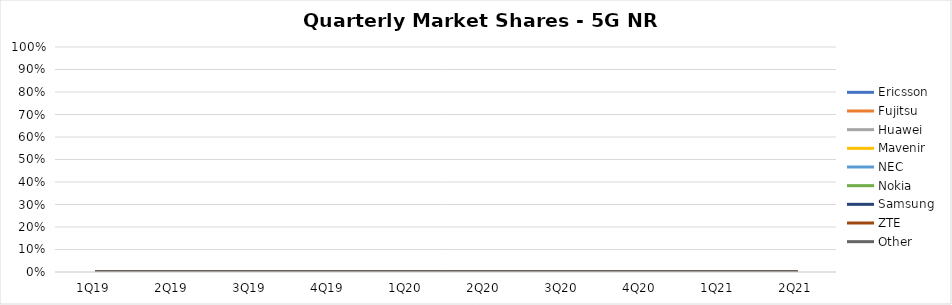
| Category | Ericsson | Fujitsu | Huawei | Mavenir | NEC | Nokia | Samsung | ZTE | Other |
|---|---|---|---|---|---|---|---|---|---|
| 1Q19 | 0 | 0 | 0 | 0 | 0 | 0 | 0 | 0 | 0 |
| 2Q19 | 0 | 0 | 0 | 0 | 0 | 0 | 0 | 0 | 0 |
| 3Q19 | 0 | 0 | 0 | 0 | 0 | 0 | 0 | 0 | 0 |
| 4Q19 | 0 | 0 | 0 | 0 | 0 | 0 | 0 | 0 | 0 |
| 1Q20 | 0 | 0 | 0 | 0 | 0 | 0 | 0 | 0 | 0 |
| 2Q20 | 0 | 0 | 0 | 0 | 0 | 0 | 0 | 0 | 0 |
| 3Q20 | 0 | 0 | 0 | 0 | 0 | 0 | 0 | 0 | 0 |
| 4Q20 | 0 | 0 | 0 | 0 | 0 | 0 | 0 | 0 | 0 |
| 1Q21 | 0 | 0 | 0 | 0 | 0 | 0 | 0 | 0 | 0 |
| 2Q21 | 0 | 0 | 0 | 0 | 0 | 0 | 0 | 0 | 0 |